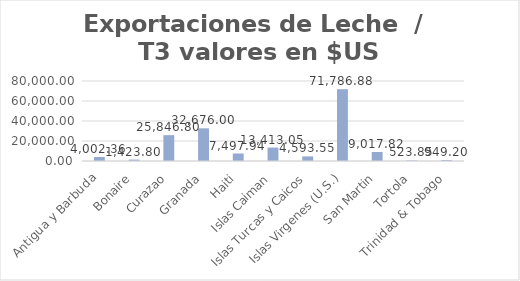
| Category | Valor US  |
|---|---|
| Antigua y Barbuda | 4002.36 |
| Bonaire | 1423.8 |
| Curazao | 25846.8 |
| Granada | 32676 |
| Haiti | 7497.94 |
| Islas Caiman | 13413.05 |
| Islas Turcas y Caicos | 4593.55 |
| Islas Virgenes (U.S.) | 71786.88 |
| San Martin | 9017.82 |
| Tortola | 523.85 |
| Trinidad & Tobago | 949.2 |